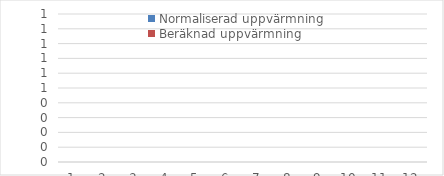
| Category | Normaliserad uppvärmning | Beräknad uppvärmning |
|---|---|---|
| 0 | 0 |  |
| 1 | 0 |  |
| 2 | 0 |  |
| 3 | 0 |  |
| 4 | 0 |  |
| 5 | 0 |  |
| 6 | 0 |  |
| 7 | 0 |  |
| 8 | 0 |  |
| 9 | 0 |  |
| 10 | 0 |  |
| 11 | 0 |  |